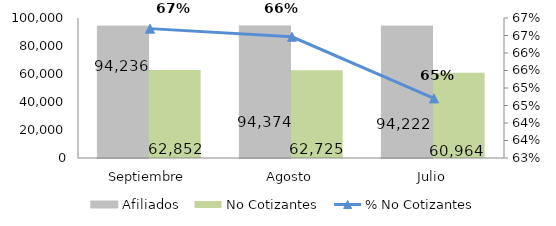
| Category | Afiliados | No Cotizantes |
|---|---|---|
| Septiembre | 94236 | 62852 |
| Agosto | 94374 | 62725 |
| Julio | 94222 | 60964 |